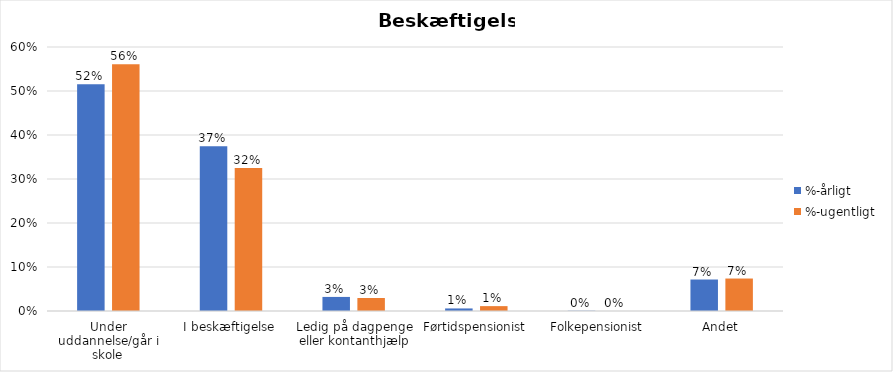
| Category | %-årligt | %-ugentligt |
|---|---|---|
| Under uddannelse/går i skole | 0.515 | 0.561 |
| I beskæftigelse | 0.375 | 0.325 |
| Ledig på dagpenge eller kontanthjælp | 0.032 | 0.03 |
| Førtidspensionist | 0.006 | 0.011 |
| Folkepensionist | 0.001 | 0 |
| Andet | 0.072 | 0.074 |